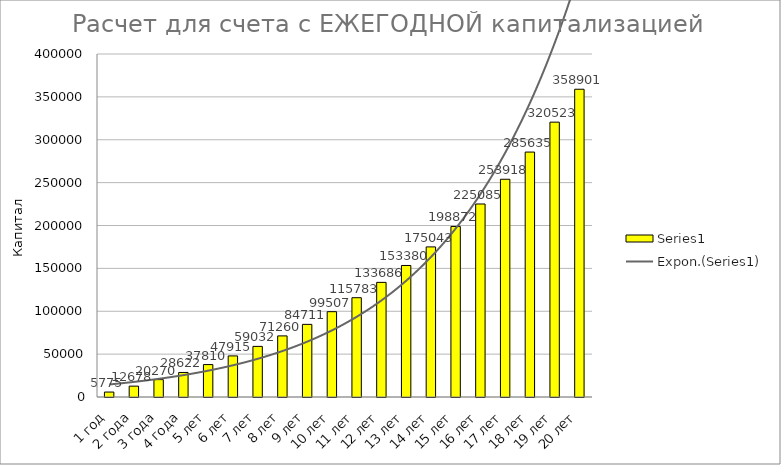
| Category | Series 0 |
|---|---|
| 1 год | 5775 |
| 2 года | 12677.5 |
| 3 года | 20270.25 |
| 4 года | 28622.275 |
| 5 лет | 37809.503 |
| 6 лет | 47915.453 |
| 7 лет | 59031.998 |
| 8 лет | 71260.198 |
| 9 лет | 84711.218 |
| 10 лет | 99507.34 |
| 11 лет | 115783.074 |
| 12 лет | 133686.381 |
| 13 лет | 153380.019 |
| 14 лет | 175043.021 |
| 15 лет | 198872.323 |
| 16 лет | 225084.556 |
| 17 лет | 253918.011 |
| 18 лет | 285634.812 |
| 19 лет | 320523.293 |
| 20 лет | 358900.623 |